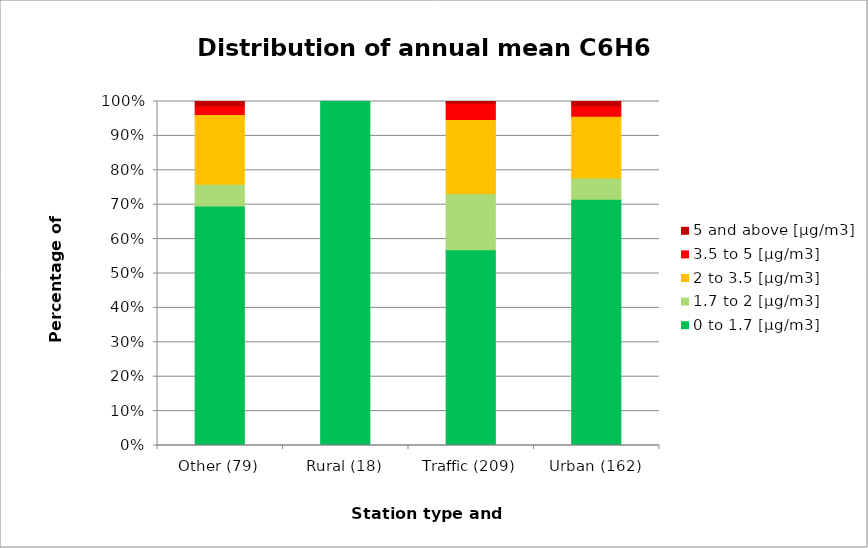
| Category | 0 to 1.7 [µg/m3] | 1.7 to 2 [µg/m3] | 2 to 3.5 [µg/m3] | 3.5 to 5 [µg/m3] | 5 and above [µg/m3] |
|---|---|---|---|---|---|
| Other (79) | 0.696 | 0.063 | 0.203 | 0.025 | 0.013 |
| Rural (18) | 1 | 0 | 0 | 0 | 0 |
| Traffic (209) | 0.569 | 0.163 | 0.215 | 0.048 | 0.005 |
| Urban (162) | 0.716 | 0.062 | 0.179 | 0.031 | 0.012 |